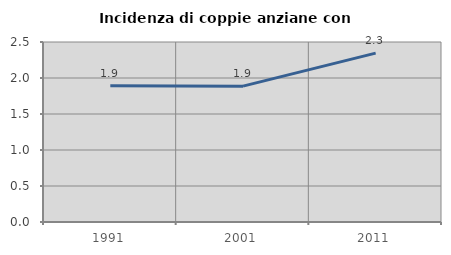
| Category | Incidenza di coppie anziane con figli |
|---|---|
| 1991.0 | 1.893 |
| 2001.0 | 1.887 |
| 2011.0 | 2.346 |